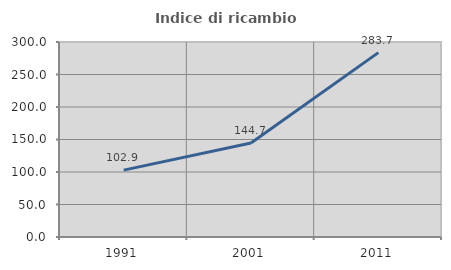
| Category | Indice di ricambio occupazionale  |
|---|---|
| 1991.0 | 102.875 |
| 2001.0 | 144.742 |
| 2011.0 | 283.694 |